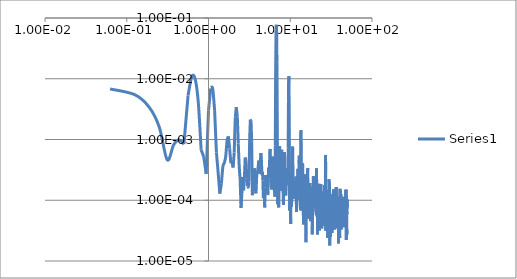
| Category | Series 0 |
|---|---|
| 0.0625 | 0.007 |
| 0.125 | 0.005 |
| 0.1875 | 0.003 |
| 0.25 | 0.002 |
| 0.3125 | 0 |
| 0.375 | 0.001 |
| 0.4375 | 0.001 |
| 0.5 | 0.001 |
| 0.5625 | 0.005 |
| 0.625 | 0.011 |
| 0.6875 | 0.01 |
| 0.75 | 0.004 |
| 0.8125 | 0.001 |
| 0.875 | 0.001 |
| 0.9375 | 0 |
| 1.0 | 0.003 |
| 1.0625 | 0.007 |
| 1.125 | 0.007 |
| 1.1875 | 0.003 |
| 1.25 | 0.001 |
| 1.3125 | 0 |
| 1.375 | 0 |
| 1.4375 | 0 |
| 1.5 | 0 |
| 1.5625 | 0 |
| 1.625 | 0.001 |
| 1.6875 | 0.001 |
| 1.75 | 0.001 |
| 1.8125 | 0.001 |
| 1.875 | 0 |
| 1.9375 | 0 |
| 2.0 | 0 |
| 2.0625 | 0.001 |
| 2.125 | 0.002 |
| 2.1875 | 0.003 |
| 2.25 | 0.002 |
| 2.3125 | 0.001 |
| 2.375 | 0 |
| 2.4375 | 0 |
| 2.5 | 0 |
| 2.5625 | 0 |
| 2.625 | 0 |
| 2.6875 | 0 |
| 2.75 | 0 |
| 2.8125 | 0.001 |
| 2.875 | 0 |
| 2.9375 | 0 |
| 3.0 | 0 |
| 3.0625 | 0 |
| 3.125 | 0 |
| 3.1875 | 0.001 |
| 3.25 | 0.002 |
| 3.3125 | 0.002 |
| 3.375 | 0.001 |
| 3.4375 | 0 |
| 3.5 | 0 |
| 3.5625 | 0 |
| 3.625 | 0 |
| 3.6875 | 0 |
| 3.75 | 0 |
| 3.8125 | 0 |
| 3.875 | 0 |
| 3.9375 | 0 |
| 4.0 | 0 |
| 4.0625 | 0 |
| 4.125 | 0 |
| 4.1875 | 0 |
| 4.25 | 0 |
| 4.3125 | 0 |
| 4.375 | 0.001 |
| 4.4375 | 0 |
| 4.5 | 0 |
| 4.5625 | 0 |
| 4.625 | 0 |
| 4.6875 | 0 |
| 4.75 | 0 |
| 4.8125 | 0 |
| 4.875 | 0 |
| 4.9375 | 0 |
| 5.0 | 0 |
| 5.0625 | 0 |
| 5.125 | 0 |
| 5.1875 | 0 |
| 5.25 | 0 |
| 5.3125 | 0 |
| 5.375 | 0 |
| 5.4375 | 0 |
| 5.5 | 0 |
| 5.5625 | 0 |
| 5.625 | 0.001 |
| 5.6875 | 0.001 |
| 5.75 | 0 |
| 5.8125 | 0 |
| 5.875 | 0 |
| 5.9375 | 0 |
| 6.0 | 0 |
| 6.0625 | 0 |
| 6.125 | 0.001 |
| 6.1875 | 0 |
| 6.25 | 0 |
| 6.3125 | 0 |
| 6.375 | 0 |
| 6.4375 | 0 |
| 6.5 | 0 |
| 6.5625 | 0.001 |
| 6.625 | 0.012 |
| 6.6875 | 0.047 |
| 6.75 | 0.077 |
| 6.8125 | 0.059 |
| 6.875 | 0.019 |
| 6.9375 | 0.002 |
| 7.0 | 0 |
| 7.0625 | 0 |
| 7.125 | 0 |
| 7.1875 | 0 |
| 7.25 | 0 |
| 7.3125 | 0 |
| 7.375 | 0.001 |
| 7.4375 | 0.001 |
| 7.5 | 0 |
| 7.5625 | 0 |
| 7.625 | 0 |
| 7.6875 | 0 |
| 7.75 | 0 |
| 7.8125 | 0.001 |
| 7.875 | 0.001 |
| 7.9375 | 0 |
| 8.0 | 0 |
| 8.0625 | 0 |
| 8.125 | 0 |
| 8.1875 | 0 |
| 8.25 | 0 |
| 8.3125 | 0 |
| 8.375 | 0 |
| 8.4375 | 0 |
| 8.5 | 0.001 |
| 8.5625 | 0 |
| 8.625 | 0 |
| 8.6875 | 0 |
| 8.75 | 0 |
| 8.8125 | 0 |
| 8.875 | 0 |
| 8.9375 | 0 |
| 9.0 | 0 |
| 9.0625 | 0 |
| 9.125 | 0 |
| 9.1875 | 0 |
| 9.25 | 0 |
| 9.3125 | 0 |
| 9.375 | 0 |
| 9.4375 | 0.001 |
| 9.5 | 0.004 |
| 9.5625 | 0.01 |
| 9.625 | 0.011 |
| 9.6875 | 0.005 |
| 9.75 | 0.001 |
| 9.8125 | 0 |
| 9.875 | 0 |
| 9.9375 | 0 |
| 10.0 | 0 |
| 10.0625 | 0 |
| 10.125 | 0 |
| 10.1875 | 0 |
| 10.25 | 0 |
| 10.3125 | 0 |
| 10.375 | 0 |
| 10.4375 | 0 |
| 10.5 | 0 |
| 10.5625 | 0 |
| 10.625 | 0.001 |
| 10.6875 | 0.001 |
| 10.75 | 0.001 |
| 10.8125 | 0 |
| 10.875 | 0 |
| 10.9375 | 0 |
| 11.0 | 0 |
| 11.0625 | 0 |
| 11.125 | 0 |
| 11.1875 | 0 |
| 11.25 | 0 |
| 11.3125 | 0 |
| 11.375 | 0 |
| 11.4375 | 0 |
| 11.5 | 0 |
| 11.5625 | 0 |
| 11.625 | 0 |
| 11.6875 | 0 |
| 11.75 | 0 |
| 11.8125 | 0 |
| 11.875 | 0 |
| 11.9375 | 0 |
| 12.0 | 0 |
| 12.0625 | 0 |
| 12.125 | 0 |
| 12.1875 | 0 |
| 12.25 | 0 |
| 12.3125 | 0 |
| 12.375 | 0 |
| 12.4375 | 0 |
| 12.5 | 0 |
| 12.5625 | 0 |
| 12.625 | 0 |
| 12.6875 | 0 |
| 12.75 | 0 |
| 12.8125 | 0 |
| 12.875 | 0.001 |
| 12.9375 | 0 |
| 13.0 | 0 |
| 13.0625 | 0 |
| 13.125 | 0 |
| 13.1875 | 0 |
| 13.25 | 0 |
| 13.3125 | 0 |
| 13.375 | 0 |
| 13.4375 | 0.001 |
| 13.5 | 0.001 |
| 13.5625 | 0.001 |
| 13.625 | 0.001 |
| 13.6875 | 0 |
| 13.75 | 0 |
| 13.8125 | 0 |
| 13.875 | 0 |
| 13.9375 | 0 |
| 14.0 | 0 |
| 14.0625 | 0 |
| 14.125 | 0 |
| 14.1875 | 0 |
| 14.25 | 0 |
| 14.3125 | 0 |
| 14.375 | 0 |
| 14.4375 | 0 |
| 14.5 | 0 |
| 14.5625 | 0 |
| 14.625 | 0 |
| 14.6875 | 0 |
| 14.75 | 0 |
| 14.8125 | 0 |
| 14.875 | 0 |
| 14.9375 | 0 |
| 15.0 | 0 |
| 15.0625 | 0 |
| 15.125 | 0 |
| 15.1875 | 0 |
| 15.25 | 0 |
| 15.3125 | 0 |
| 15.375 | 0 |
| 15.4375 | 0 |
| 15.5 | 0 |
| 15.5625 | 0 |
| 15.625 | 0 |
| 15.6875 | 0 |
| 15.75 | 0 |
| 15.8125 | 0 |
| 15.875 | 0 |
| 15.9375 | 0 |
| 16.0 | 0 |
| 16.0625 | 0 |
| 16.125 | 0 |
| 16.1875 | 0 |
| 16.25 | 0 |
| 16.3125 | 0 |
| 16.375 | 0 |
| 16.4375 | 0 |
| 16.5 | 0 |
| 16.5625 | 0 |
| 16.625 | 0 |
| 16.6875 | 0 |
| 16.75 | 0 |
| 16.8125 | 0 |
| 16.875 | 0 |
| 16.9375 | 0 |
| 17.0 | 0 |
| 17.0625 | 0 |
| 17.125 | 0 |
| 17.1875 | 0 |
| 17.25 | 0 |
| 17.3125 | 0 |
| 17.375 | 0 |
| 17.4375 | 0 |
| 17.5 | 0 |
| 17.5625 | 0 |
| 17.625 | 0 |
| 17.6875 | 0 |
| 17.75 | 0 |
| 17.8125 | 0 |
| 17.875 | 0 |
| 17.9375 | 0 |
| 18.0 | 0 |
| 18.0625 | 0 |
| 18.125 | 0 |
| 18.1875 | 0 |
| 18.25 | 0 |
| 18.3125 | 0 |
| 18.375 | 0 |
| 18.4375 | 0 |
| 18.5 | 0 |
| 18.5625 | 0 |
| 18.625 | 0 |
| 18.6875 | 0 |
| 18.75 | 0 |
| 18.8125 | 0 |
| 18.875 | 0 |
| 18.9375 | 0 |
| 19.0 | 0 |
| 19.0625 | 0 |
| 19.125 | 0 |
| 19.1875 | 0 |
| 19.25 | 0 |
| 19.3125 | 0 |
| 19.375 | 0 |
| 19.4375 | 0 |
| 19.5 | 0 |
| 19.5625 | 0 |
| 19.625 | 0 |
| 19.6875 | 0 |
| 19.75 | 0 |
| 19.8125 | 0 |
| 19.875 | 0 |
| 19.9375 | 0 |
| 20.0 | 0 |
| 20.0625 | 0 |
| 20.125 | 0 |
| 20.1875 | 0 |
| 20.25 | 0 |
| 20.3125 | 0 |
| 20.375 | 0 |
| 20.4375 | 0 |
| 20.5 | 0 |
| 20.5625 | 0 |
| 20.625 | 0 |
| 20.6875 | 0 |
| 20.75 | 0 |
| 20.8125 | 0 |
| 20.875 | 0 |
| 20.9375 | 0 |
| 21.0 | 0 |
| 21.0625 | 0 |
| 21.125 | 0 |
| 21.1875 | 0 |
| 21.25 | 0 |
| 21.3125 | 0 |
| 21.375 | 0 |
| 21.4375 | 0 |
| 21.5 | 0 |
| 21.5625 | 0 |
| 21.625 | 0 |
| 21.6875 | 0 |
| 21.75 | 0 |
| 21.8125 | 0 |
| 21.875 | 0 |
| 21.9375 | 0 |
| 22.0 | 0 |
| 22.0625 | 0 |
| 22.125 | 0 |
| 22.1875 | 0 |
| 22.25 | 0 |
| 22.3125 | 0 |
| 22.375 | 0 |
| 22.4375 | 0 |
| 22.5 | 0 |
| 22.5625 | 0 |
| 22.625 | 0 |
| 22.6875 | 0 |
| 22.75 | 0 |
| 22.8125 | 0 |
| 22.875 | 0 |
| 22.9375 | 0 |
| 23.0 | 0 |
| 23.0625 | 0 |
| 23.125 | 0 |
| 23.1875 | 0 |
| 23.25 | 0 |
| 23.3125 | 0 |
| 23.375 | 0 |
| 23.4375 | 0 |
| 23.5 | 0 |
| 23.5625 | 0 |
| 23.625 | 0 |
| 23.6875 | 0 |
| 23.75 | 0 |
| 23.8125 | 0 |
| 23.875 | 0 |
| 23.9375 | 0 |
| 24.0 | 0 |
| 24.0625 | 0 |
| 24.125 | 0 |
| 24.1875 | 0 |
| 24.25 | 0 |
| 24.3125 | 0 |
| 24.375 | 0 |
| 24.4375 | 0 |
| 24.5 | 0 |
| 24.5625 | 0 |
| 24.625 | 0 |
| 24.6875 | 0 |
| 24.75 | 0 |
| 24.8125 | 0 |
| 24.875 | 0 |
| 24.9375 | 0 |
| 25.0 | 0 |
| 25.0625 | 0 |
| 25.125 | 0 |
| 25.1875 | 0 |
| 25.25 | 0 |
| 25.3125 | 0 |
| 25.375 | 0 |
| 25.4375 | 0 |
| 25.5 | 0 |
| 25.5625 | 0 |
| 25.625 | 0 |
| 25.6875 | 0 |
| 25.75 | 0 |
| 25.8125 | 0 |
| 25.875 | 0 |
| 25.9375 | 0 |
| 26.0 | 0 |
| 26.0625 | 0 |
| 26.125 | 0 |
| 26.1875 | 0 |
| 26.25 | 0 |
| 26.3125 | 0 |
| 26.375 | 0 |
| 26.4375 | 0 |
| 26.5 | 0 |
| 26.5625 | 0 |
| 26.625 | 0 |
| 26.6875 | 0 |
| 26.75 | 0 |
| 26.8125 | 0 |
| 26.875 | 0 |
| 26.9375 | 0 |
| 27.0 | 0.001 |
| 27.0625 | 0.001 |
| 27.125 | 0 |
| 27.1875 | 0 |
| 27.25 | 0 |
| 27.3125 | 0 |
| 27.375 | 0 |
| 27.4375 | 0 |
| 27.5 | 0 |
| 27.5625 | 0 |
| 27.625 | 0 |
| 27.6875 | 0 |
| 27.75 | 0 |
| 27.8125 | 0 |
| 27.875 | 0 |
| 27.9375 | 0 |
| 28.0 | 0 |
| 28.0625 | 0 |
| 28.125 | 0 |
| 28.1875 | 0 |
| 28.25 | 0 |
| 28.3125 | 0 |
| 28.375 | 0 |
| 28.4375 | 0 |
| 28.5 | 0 |
| 28.5625 | 0 |
| 28.625 | 0 |
| 28.6875 | 0 |
| 28.75 | 0 |
| 28.8125 | 0 |
| 28.875 | 0 |
| 28.9375 | 0 |
| 29.0 | 0 |
| 29.0625 | 0 |
| 29.125 | 0 |
| 29.1875 | 0 |
| 29.25 | 0 |
| 29.3125 | 0 |
| 29.375 | 0 |
| 29.4375 | 0 |
| 29.5 | 0 |
| 29.5625 | 0 |
| 29.625 | 0 |
| 29.6875 | 0 |
| 29.75 | 0 |
| 29.8125 | 0 |
| 29.875 | 0 |
| 29.9375 | 0 |
| 30.0 | 0 |
| 30.0625 | 0 |
| 30.125 | 0 |
| 30.1875 | 0 |
| 30.25 | 0 |
| 30.3125 | 0 |
| 30.375 | 0 |
| 30.4375 | 0 |
| 30.5 | 0 |
| 30.5625 | 0 |
| 30.625 | 0 |
| 30.6875 | 0 |
| 30.75 | 0 |
| 30.8125 | 0 |
| 30.875 | 0 |
| 30.9375 | 0 |
| 31.0 | 0 |
| 31.0625 | 0 |
| 31.125 | 0 |
| 31.1875 | 0 |
| 31.25 | 0 |
| 31.3125 | 0 |
| 31.375 | 0 |
| 31.4375 | 0 |
| 31.5 | 0 |
| 31.5625 | 0 |
| 31.625 | 0 |
| 31.6875 | 0 |
| 31.75 | 0 |
| 31.8125 | 0 |
| 31.875 | 0 |
| 31.9375 | 0 |
| 32.0 | 0 |
| 32.0625 | 0 |
| 32.125 | 0 |
| 32.1875 | 0 |
| 32.25 | 0 |
| 32.3125 | 0 |
| 32.375 | 0 |
| 32.4375 | 0 |
| 32.5 | 0 |
| 32.5625 | 0 |
| 32.625 | 0 |
| 32.6875 | 0 |
| 32.75 | 0 |
| 32.8125 | 0 |
| 32.875 | 0 |
| 32.9375 | 0 |
| 33.0 | 0 |
| 33.0625 | 0 |
| 33.125 | 0 |
| 33.1875 | 0 |
| 33.25 | 0 |
| 33.3125 | 0 |
| 33.375 | 0 |
| 33.4375 | 0 |
| 33.5 | 0 |
| 33.5625 | 0 |
| 33.625 | 0 |
| 33.6875 | 0 |
| 33.75 | 0 |
| 33.8125 | 0 |
| 33.875 | 0 |
| 33.9375 | 0 |
| 34.0 | 0 |
| 34.0625 | 0 |
| 34.125 | 0 |
| 34.1875 | 0 |
| 34.25 | 0 |
| 34.3125 | 0 |
| 34.375 | 0 |
| 34.4375 | 0 |
| 34.5 | 0 |
| 34.5625 | 0 |
| 34.625 | 0 |
| 34.6875 | 0 |
| 34.75 | 0 |
| 34.8125 | 0 |
| 34.875 | 0 |
| 34.9375 | 0 |
| 35.0 | 0 |
| 35.0625 | 0 |
| 35.125 | 0 |
| 35.1875 | 0 |
| 35.25 | 0 |
| 35.3125 | 0 |
| 35.375 | 0 |
| 35.4375 | 0 |
| 35.5 | 0 |
| 35.5625 | 0 |
| 35.625 | 0 |
| 35.6875 | 0 |
| 35.75 | 0 |
| 35.8125 | 0 |
| 35.875 | 0 |
| 35.9375 | 0 |
| 36.0 | 0 |
| 36.0625 | 0 |
| 36.125 | 0 |
| 36.1875 | 0 |
| 36.25 | 0 |
| 36.3125 | 0 |
| 36.375 | 0 |
| 36.4375 | 0 |
| 36.5 | 0 |
| 36.5625 | 0 |
| 36.625 | 0 |
| 36.6875 | 0 |
| 36.75 | 0 |
| 36.8125 | 0 |
| 36.875 | 0 |
| 36.9375 | 0 |
| 37.0 | 0 |
| 37.0625 | 0 |
| 37.125 | 0 |
| 37.1875 | 0 |
| 37.25 | 0 |
| 37.3125 | 0 |
| 37.375 | 0 |
| 37.4375 | 0 |
| 37.5 | 0 |
| 37.5625 | 0 |
| 37.625 | 0 |
| 37.6875 | 0 |
| 37.75 | 0 |
| 37.8125 | 0 |
| 37.875 | 0 |
| 37.9375 | 0 |
| 38.0 | 0 |
| 38.0625 | 0 |
| 38.125 | 0 |
| 38.1875 | 0 |
| 38.25 | 0 |
| 38.3125 | 0 |
| 38.375 | 0 |
| 38.4375 | 0 |
| 38.5 | 0 |
| 38.5625 | 0 |
| 38.625 | 0 |
| 38.6875 | 0 |
| 38.75 | 0 |
| 38.8125 | 0 |
| 38.875 | 0 |
| 38.9375 | 0 |
| 39.0 | 0 |
| 39.0625 | 0 |
| 39.125 | 0 |
| 39.1875 | 0 |
| 39.25 | 0 |
| 39.3125 | 0 |
| 39.375 | 0 |
| 39.4375 | 0 |
| 39.5 | 0 |
| 39.5625 | 0 |
| 39.625 | 0 |
| 39.6875 | 0 |
| 39.75 | 0 |
| 39.8125 | 0 |
| 39.875 | 0 |
| 39.9375 | 0 |
| 40.0 | 0 |
| 40.0625 | 0 |
| 40.125 | 0 |
| 40.1875 | 0 |
| 40.25 | 0 |
| 40.3125 | 0 |
| 40.375 | 0 |
| 40.4375 | 0 |
| 40.5 | 0 |
| 40.5625 | 0 |
| 40.625 | 0 |
| 40.6875 | 0 |
| 40.75 | 0 |
| 40.8125 | 0 |
| 40.875 | 0 |
| 40.9375 | 0 |
| 41.0 | 0 |
| 41.0625 | 0 |
| 41.125 | 0 |
| 41.1875 | 0 |
| 41.25 | 0 |
| 41.3125 | 0 |
| 41.375 | 0 |
| 41.4375 | 0 |
| 41.5 | 0 |
| 41.5625 | 0 |
| 41.625 | 0 |
| 41.6875 | 0 |
| 41.75 | 0 |
| 41.8125 | 0 |
| 41.875 | 0 |
| 41.9375 | 0 |
| 42.0 | 0 |
| 42.0625 | 0 |
| 42.125 | 0 |
| 42.1875 | 0 |
| 42.25 | 0 |
| 42.3125 | 0 |
| 42.375 | 0 |
| 42.4375 | 0 |
| 42.5 | 0 |
| 42.5625 | 0 |
| 42.625 | 0 |
| 42.6875 | 0 |
| 42.75 | 0 |
| 42.8125 | 0 |
| 42.875 | 0 |
| 42.9375 | 0 |
| 43.0 | 0 |
| 43.0625 | 0 |
| 43.125 | 0 |
| 43.1875 | 0 |
| 43.25 | 0 |
| 43.3125 | 0 |
| 43.375 | 0 |
| 43.4375 | 0 |
| 43.5 | 0 |
| 43.5625 | 0 |
| 43.625 | 0 |
| 43.6875 | 0 |
| 43.75 | 0 |
| 43.8125 | 0 |
| 43.875 | 0 |
| 43.9375 | 0 |
| 44.0 | 0 |
| 44.0625 | 0 |
| 44.125 | 0 |
| 44.1875 | 0 |
| 44.25 | 0 |
| 44.3125 | 0 |
| 44.375 | 0 |
| 44.4375 | 0 |
| 44.5 | 0 |
| 44.5625 | 0 |
| 44.625 | 0 |
| 44.6875 | 0 |
| 44.75 | 0 |
| 44.8125 | 0 |
| 44.875 | 0 |
| 44.9375 | 0 |
| 45.0 | 0 |
| 45.0625 | 0 |
| 45.125 | 0 |
| 45.1875 | 0 |
| 45.25 | 0 |
| 45.3125 | 0 |
| 45.375 | 0 |
| 45.4375 | 0 |
| 45.5 | 0 |
| 45.5625 | 0 |
| 45.625 | 0 |
| 45.6875 | 0 |
| 45.75 | 0 |
| 45.8125 | 0 |
| 45.875 | 0 |
| 45.9375 | 0 |
| 46.0 | 0 |
| 46.0625 | 0 |
| 46.125 | 0 |
| 46.1875 | 0 |
| 46.25 | 0 |
| 46.3125 | 0 |
| 46.375 | 0 |
| 46.4375 | 0 |
| 46.5 | 0 |
| 46.5625 | 0 |
| 46.625 | 0 |
| 46.6875 | 0 |
| 46.75 | 0 |
| 46.8125 | 0 |
| 46.875 | 0 |
| 46.9375 | 0 |
| 47.0 | 0 |
| 47.0625 | 0 |
| 47.125 | 0 |
| 47.1875 | 0 |
| 47.25 | 0 |
| 47.3125 | 0 |
| 47.375 | 0 |
| 47.4375 | 0 |
| 47.5 | 0 |
| 47.5625 | 0 |
| 47.625 | 0 |
| 47.6875 | 0 |
| 47.75 | 0 |
| 47.8125 | 0 |
| 47.875 | 0 |
| 47.9375 | 0 |
| 48.0 | 0 |
| 48.0625 | 0 |
| 48.125 | 0 |
| 48.1875 | 0 |
| 48.25 | 0 |
| 48.3125 | 0 |
| 48.375 | 0 |
| 48.4375 | 0 |
| 48.5 | 0 |
| 48.5625 | 0 |
| 48.625 | 0 |
| 48.6875 | 0 |
| 48.75 | 0 |
| 48.8125 | 0 |
| 48.875 | 0 |
| 48.9375 | 0 |
| 49.0 | 0 |
| 49.0625 | 0 |
| 49.125 | 0 |
| 49.1875 | 0 |
| 49.25 | 0 |
| 49.3125 | 0 |
| 49.375 | 0 |
| 49.4375 | 0 |
| 49.5 | 0 |
| 49.5625 | 0 |
| 49.625 | 0 |
| 49.6875 | 0 |
| 49.75 | 0 |
| 49.8125 | 0 |
| 49.875 | 0 |
| 49.9375 | 0 |
| 50.0 | 0 |